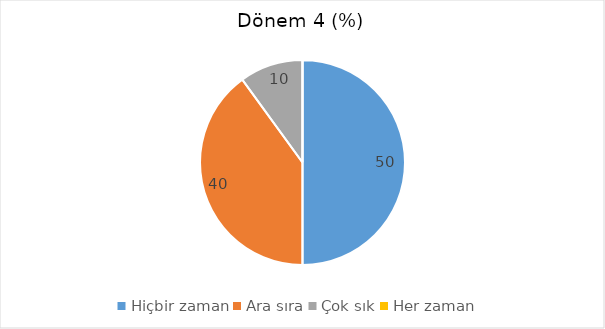
| Category | Dönem 4  (%) |
|---|---|
| Hiçbir zaman | 50 |
| Ara sıra | 40 |
| Çok sık | 10 |
| Her zaman | 0 |